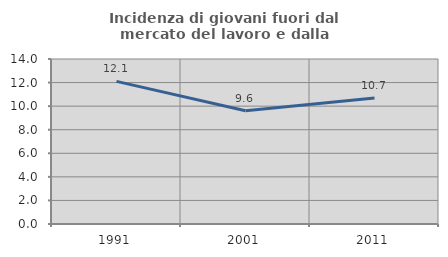
| Category | Incidenza di giovani fuori dal mercato del lavoro e dalla formazione  |
|---|---|
| 1991.0 | 12.102 |
| 2001.0 | 9.615 |
| 2011.0 | 10.7 |